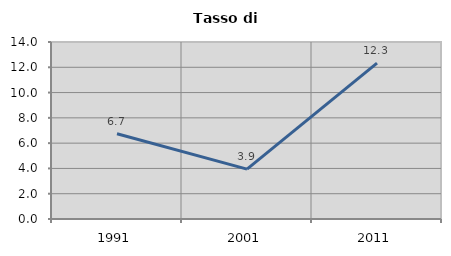
| Category | Tasso di disoccupazione   |
|---|---|
| 1991.0 | 6.742 |
| 2001.0 | 3.947 |
| 2011.0 | 12.329 |